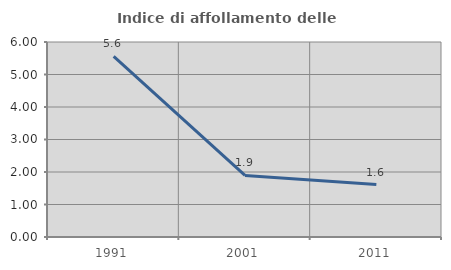
| Category | Indice di affollamento delle abitazioni  |
|---|---|
| 1991.0 | 5.554 |
| 2001.0 | 1.896 |
| 2011.0 | 1.614 |